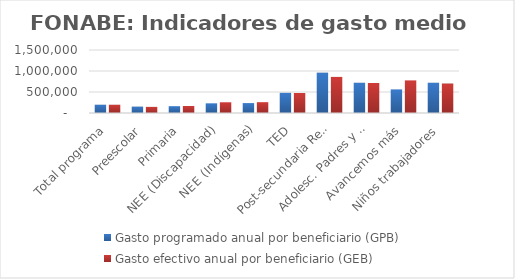
| Category | Gasto programado anual por beneficiario (GPB)  | Gasto efectivo anual por beneficiario (GEB)  |
|---|---|---|
| Total programa | 196784.711 | 196427.202 |
| Preescolar | 151412.903 | 145485.151 |
| Primaria | 162425.434 | 166507.634 |
| NEE (Discapacidad) | 230393.32 | 255419.33 |
| NEE (Indígenas) | 236174.649 | 257643.071 |
| TED | 480000 | 476508.728 |
| Post-secundaria Regular | 960000 | 859251.752 |
| Adolesc. Padres y Madres | 720000 | 714390.342 |
| Avancemos más | 562130.178 | 776416.667 |
| Niños trabajadores | 720000 | 701454.545 |